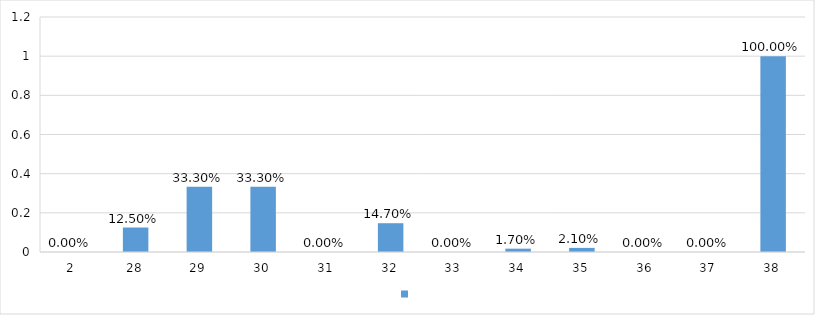
| Category | Series 0 |
|---|---|
| 2 | 0 |
| 28 | 0.125 |
| 29 | 0.333 |
| 30 | 0.333 |
| 31 | 0 |
| 32 | 0.147 |
| 33 | 0 |
| 34 | 0.017 |
| 35 | 0.021 |
| 36 | 0 |
| 37 | 0 |
| 38 | 1 |